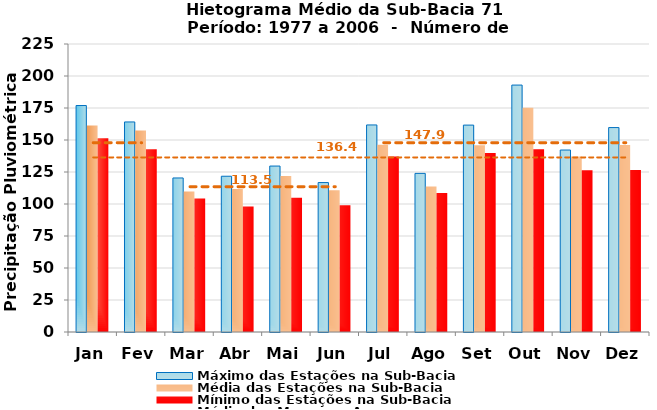
| Category | Máximo das Estações na Sub-Bacia | Média das Estações na Sub-Bacia | Mínimo das Estações na Sub-Bacia |
|---|---|---|---|
| Jan | 176.94 | 161.279 | 151.417 |
| Fev | 164.103 | 157.401 | 142.867 |
| Mar | 120.34 | 109.714 | 104.353 |
| Abr | 121.69 | 111.684 | 98.024 |
| Mai | 129.64 | 121.86 | 104.841 |
| Jun | 116.74 | 110.797 | 99.003 |
| Jul | 161.759 | 146.257 | 137.207 |
| Ago | 123.923 | 113.664 | 108.54 |
| Set | 161.638 | 145.931 | 139.937 |
| Out | 192.91 | 175.124 | 142.843 |
| Nov | 142.169 | 137.207 | 126.363 |
| Dez | 159.71 | 146.084 | 126.645 |